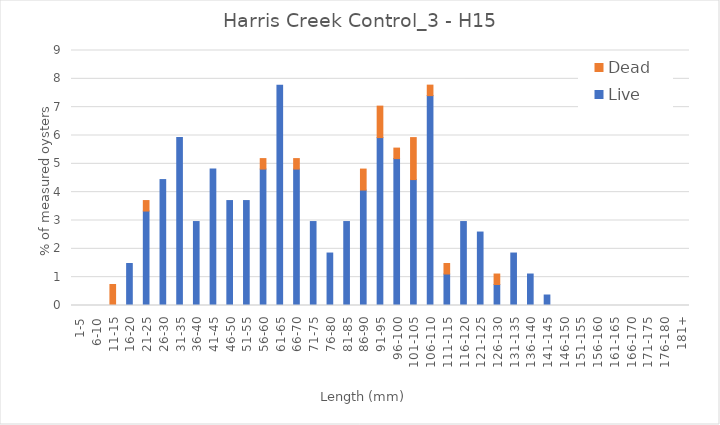
| Category | Live | Dead |
|---|---|---|
| 1-5 | 0 | 0 |
| 6-10 | 0 | 0 |
| 11-15 | 0 | 0.741 |
| 16-20 | 1.481 | 0 |
| 21-25 | 3.333 | 0.37 |
| 26-30 | 4.444 | 0 |
| 31-35 | 5.926 | 0 |
| 36-40 | 2.963 | 0 |
| 41-45 | 4.815 | 0 |
| 46-50 | 3.704 | 0 |
| 51-55 | 3.704 | 0 |
| 56-60 | 4.815 | 0.37 |
| 61-65 | 7.778 | 0 |
| 66-70 | 4.815 | 0.37 |
| 71-75 | 2.963 | 0 |
| 76-80 | 1.852 | 0 |
| 81-85 | 2.963 | 0 |
| 86-90 | 4.074 | 0.741 |
| 91-95 | 5.926 | 1.111 |
| 96-100 | 5.185 | 0.37 |
| 101-105 | 4.444 | 1.481 |
| 106-110 | 7.407 | 0.37 |
| 111-115 | 1.111 | 0.37 |
| 116-120 | 2.963 | 0 |
| 121-125 | 2.593 | 0 |
| 126-130 | 0.741 | 0.37 |
| 131-135 | 1.852 | 0 |
| 136-140 | 1.111 | 0 |
| 141-145 | 0.37 | 0 |
| 146-150 | 0 | 0 |
| 151-155 | 0 | 0 |
| 156-160 | 0 | 0 |
| 161-165 | 0 | 0 |
| 166-170 | 0 | 0 |
| 171-175 | 0 | 0 |
| 176-180 | 0 | 0 |
| 181+ | 0 | 0 |